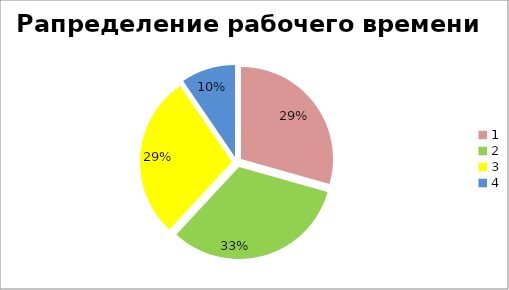
| Category | Series 0 |
|---|---|
| 0 | 0.128 |
| 1 | 0.142 |
| 2 | 0.125 |
| 3 | 0.042 |